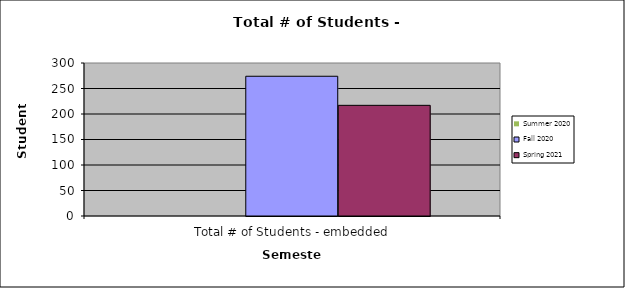
| Category | Summer 2020 | Fall 2020 | Spring 2021 |
|---|---|---|---|
| 0 | 0 | 274 | 217 |